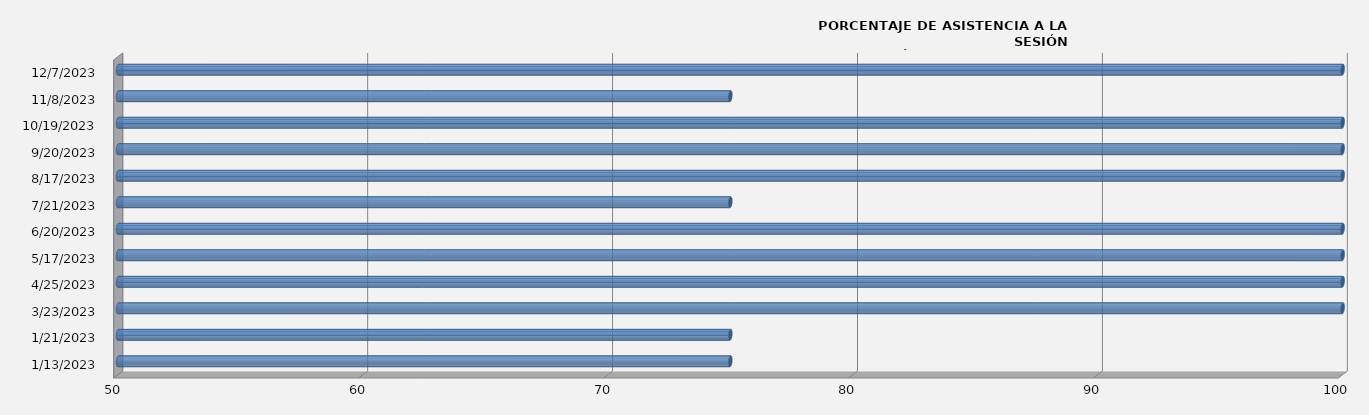
| Category | 13/01/2023 |
|---|---|
| 1/13/23 | 75 |
| 1/21/23 | 75 |
| 3/23/23 | 100 |
| 4/25/23 | 100 |
| 5/17/23 | 100 |
| 6/20/23 | 100 |
| 7/21/23 | 75 |
| 8/17/23 | 100 |
| 9/20/23 | 100 |
| 10/19/23 | 100 |
| 11/8/23 | 75 |
| 12/7/23 | 100 |